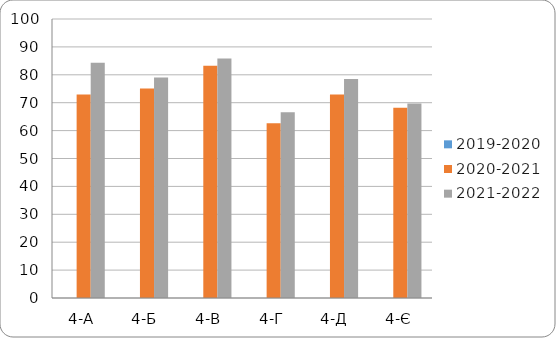
| Category | 2019-2020 | 2020-2021 | 2021-2022 |
|---|---|---|---|
| 4-А |  | 72.9 | 84.3 |
| 4-Б |  | 75.1 | 79 |
| 4-В |  | 83.2 | 85.8 |
| 4-Г |  | 62.6 | 66.6 |
| 4-Д |  | 72.9 | 78.5 |
| 4-Є |  | 68.2 | 69.7 |